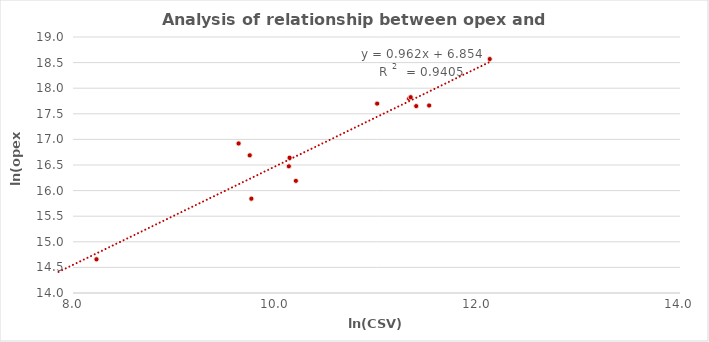
| Category | Series 0 |
|---|---|
| 7.973070525544062 | 14.518 |
| 11.321990885189791 | 17.796 |
| 11.337650821611913 | 17.825 |
| 11.39268328817906 | 17.65 |
| 11.00642367223745 | 17.699 |
| 9.636847119467726 | 16.921 |
| 9.747180397369462 | 16.689 |
| 8.23217218511219 | 14.659 |
| 12.119365671207861 | 18.57 |
| 10.140828586667704 | 16.641 |
| 11.520349255623806 | 17.662 |
| 10.133547850217164 | 16.475 |
| 10.20325361648577 | 16.19 |
| 9.76306419381997 | 15.841 |
| 7.856807114621192 | 14.264 |